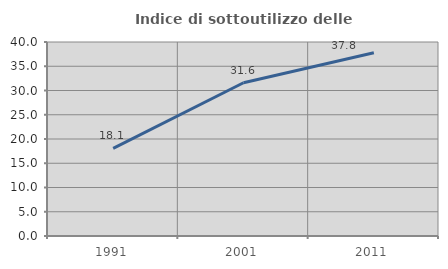
| Category | Indice di sottoutilizzo delle abitazioni  |
|---|---|
| 1991.0 | 18.053 |
| 2001.0 | 31.605 |
| 2011.0 | 37.789 |